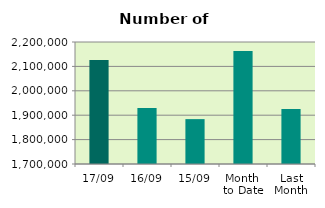
| Category | Series 0 |
|---|---|
| 17/09 | 2126546 |
| 16/09 | 1929138 |
| 15/09 | 1883898 |
| Month 
to Date | 2163188.154 |
| Last
Month | 1925290.095 |